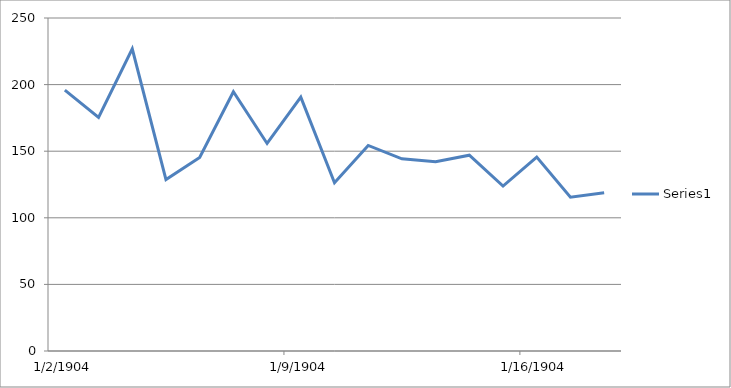
| Category | Series 0 |
|---|---|
| 0 | 195.82 |
| 1/1/00 | 175.38 |
| 1/2/00 | 226.84 |
| 1/3/00 | 128.75 |
| 1/4/00 | 145.3 |
| 1/5/00 | 194.67 |
| 1/6/00 | 155.82 |
| 1/7/00 | 190.54 |
| 1/8/00 | 126.34 |
| 1/9/00 | 154.32 |
| 1/10/00 | 144.28 |
| 1/11/00 | 142.17 |
| 1/12/00 | 147.03 |
| 1/13/00 | 123.84 |
| 1/14/00 | 145.58 |
| 1/15/00 | 115.52 |
| 1/16/00 | 118.8 |